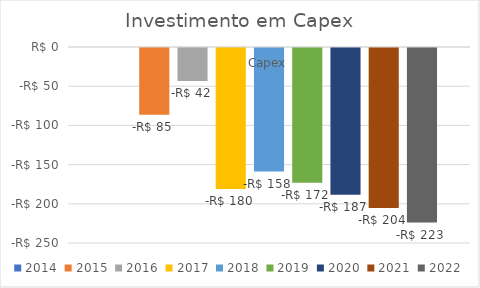
| Category | 2014 | 2015 | 2016 | 2017 | 2018 | 2019 | 2020 | 2021 | 2022 |
|---|---|---|---|---|---|---|---|---|---|
| Capex |  | -85 | -42 | -180 | -157.679 | -171.871 | -187.339 | -204.199 | -222.577 |